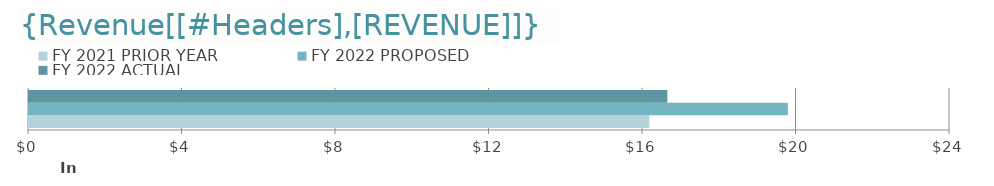
| Category | FY 2021 | FY 2022 |
|---|---|---|
| 0 | 16164.36 | 16636.01 |